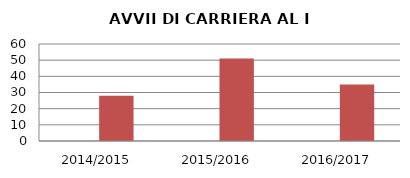
| Category | ANNO | NUMERO |
|---|---|---|
| 2014/2015 | 0 | 28 |
| 2015/2016 | 0 | 51 |
| 2016/2017 | 0 | 35 |